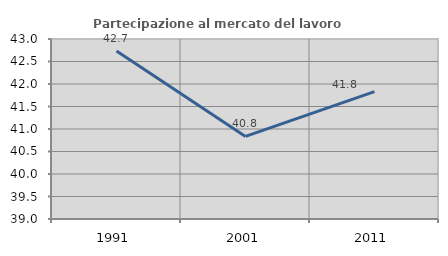
| Category | Partecipazione al mercato del lavoro  femminile |
|---|---|
| 1991.0 | 42.736 |
| 2001.0 | 40.835 |
| 2011.0 | 41.829 |